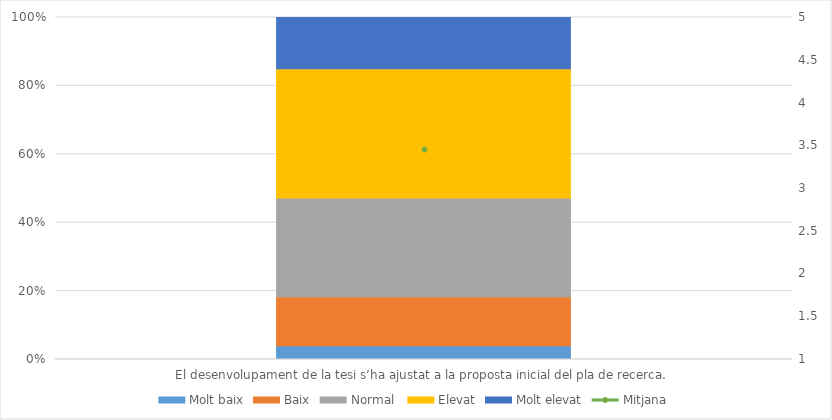
| Category | Molt baix | Baix | Normal  | Elevat | Molt elevat |
|---|---|---|---|---|---|
| El desenvolupament de la tesi s’ha ajustat a la proposta inicial del pla de recerca. | 11 | 39 | 79 | 103 | 41 |